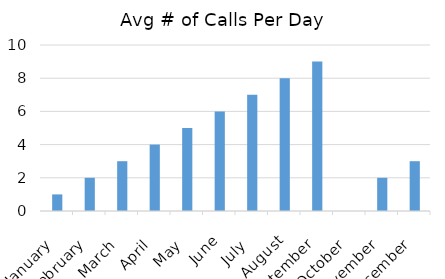
| Category | Avg # of Calls Per Day |
|---|---|
| 1900-01-01 | 1 |
| 1900-02-28 | 2 |
| 1900-03-31 | 3 |
| 1900-04-30 | 4 |
| 1900-05-31 | 5 |
| 1900-06-30 | 6 |
| 1900-07-31 | 7 |
| 1900-08-31 | 8 |
| 1900-09-30 | 9 |
| 1900-10-31 | 0 |
| 1900-11-30 | 2 |
| 1900-12-31 | 3 |